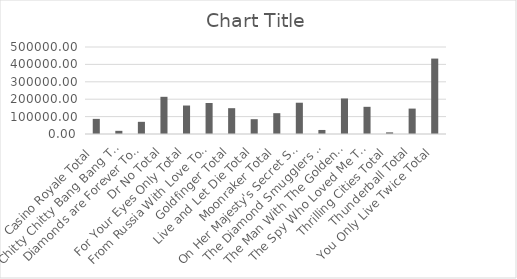
| Category | Continent | Distribution Locale | Books Distributed | Returns | Gildrose's Royalty/book | Books Sold | Pbs | Returns cost | Profitability |
|---|---|---|---|---|---|---|---|---|---|
| Casino Royale Total |  |  |  |  |  |  |  |  | 86940.23 |
| Chitty Chitty Bang Bang Total |  |  |  |  |  |  |  |  | 18228.73 |
| Diamonds are Forever Total |  |  |  |  |  |  |  |  | 69958.91 |
| Dr No Total |  |  |  |  |  |  |  |  | 213738.69 |
| For Your Eyes Only Total |  |  |  |  |  |  |  |  | 163628.3 |
| From Russia With Love Total |  |  |  |  |  |  |  |  | 178250.06 |
| Goldfinger Total |  |  |  |  |  |  |  |  | 148385.39 |
| Live and Let Die Total |  |  |  |  |  |  |  |  | 85168 |
| Moonraker Total |  |  |  |  |  |  |  |  | 119696.95 |
| On Her Majesty's Secret Service Total |  |  |  |  |  |  |  |  | 179726.84 |
| The Diamond Smugglers Total |  |  |  |  |  |  |  |  | 23211.66 |
| The Man With The Golden Gun Total |  |  |  |  |  |  |  |  | 204172.72 |
| The Spy Who Loved Me Total |  |  |  |  |  |  |  |  | 156209.34 |
| Thrilling Cities Total |  |  |  |  |  |  |  |  | 9410.58 |
| Thunderball Total |  |  |  |  |  |  |  |  | 146000.39 |
| You Only Live Twice Total |  |  |  |  |  |  |  |  | 433461.65 |